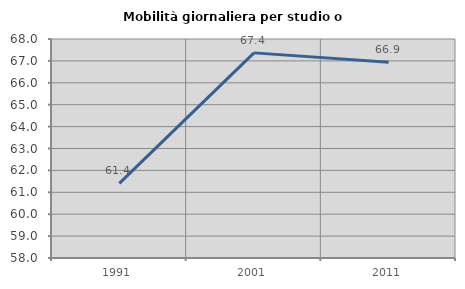
| Category | Mobilità giornaliera per studio o lavoro |
|---|---|
| 1991.0 | 61.408 |
| 2001.0 | 67.366 |
| 2011.0 | 66.94 |